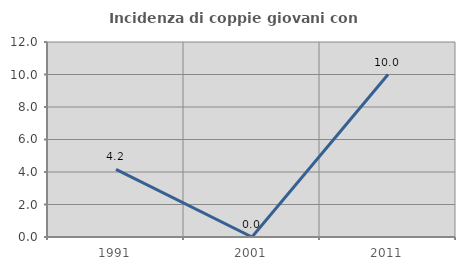
| Category | Incidenza di coppie giovani con figli |
|---|---|
| 1991.0 | 4.167 |
| 2001.0 | 0 |
| 2011.0 | 10 |